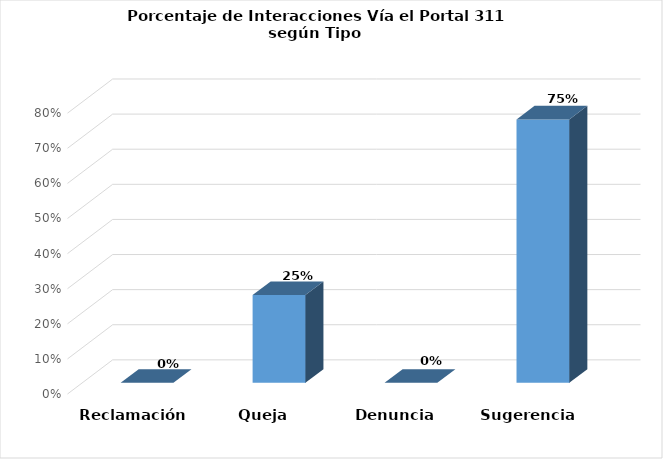
| Category | Series 0 |
|---|---|
| Reclamación | 0 |
| Queja | 0.25 |
| Denuncia | 0 |
| Sugerencia | 0.75 |